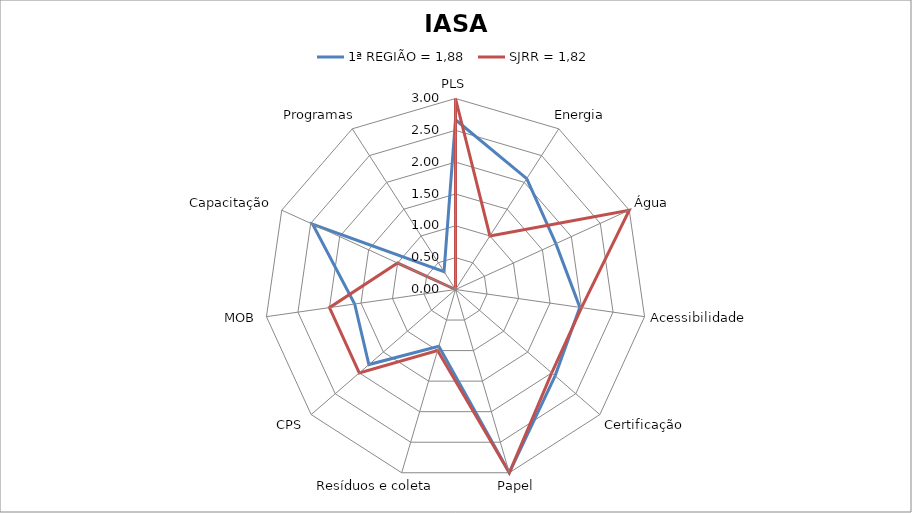
| Category | 1ª REGIÃO = 1,88 | SJRR = 1,82 |
|---|---|---|
| PLS | 2.667 | 3 |
| Energia | 2.07 | 1 |
| Água | 1.733 | 3 |
| Acessibilidade | 1.973 | 2 |
| Certificação | 2.07 | 2 |
| Papel | 3 | 3 |
| Resíduos e coleta | 0.93 | 1 |
| CPS | 1.8 | 2 |
| MOB | 1.6 | 2 |
| Capacitação | 2.467 | 1 |
| Programas | 0.333 | 0 |